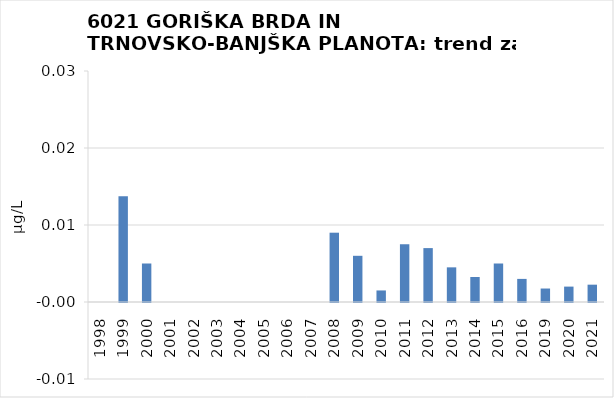
| Category | Vsota |
|---|---|
| 1998 | 0 |
| 1999 | 0.014 |
| 2000 | 0.005 |
| 2001 | 0 |
| 2002 | 0 |
| 2003 | 0 |
| 2004 | 0 |
| 2005 | 0 |
| 2006 | 0 |
| 2007 | 0 |
| 2008 | 0.009 |
| 2009 | 0.006 |
| 2010 | 0.002 |
| 2011 | 0.008 |
| 2012 | 0.007 |
| 2013 | 0.005 |
| 2014 | 0.003 |
| 2015 | 0.005 |
| 2016 | 0.003 |
| 2019 | 0.002 |
| 2020 | 0.002 |
| 2021 | 0.002 |